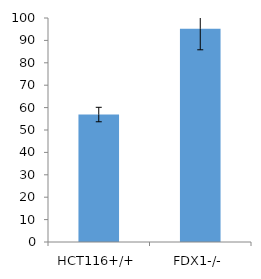
| Category | Series 0 |
|---|---|
| HCT116+/+ | 56.901 |
| FDX1-/- | 95.154 |